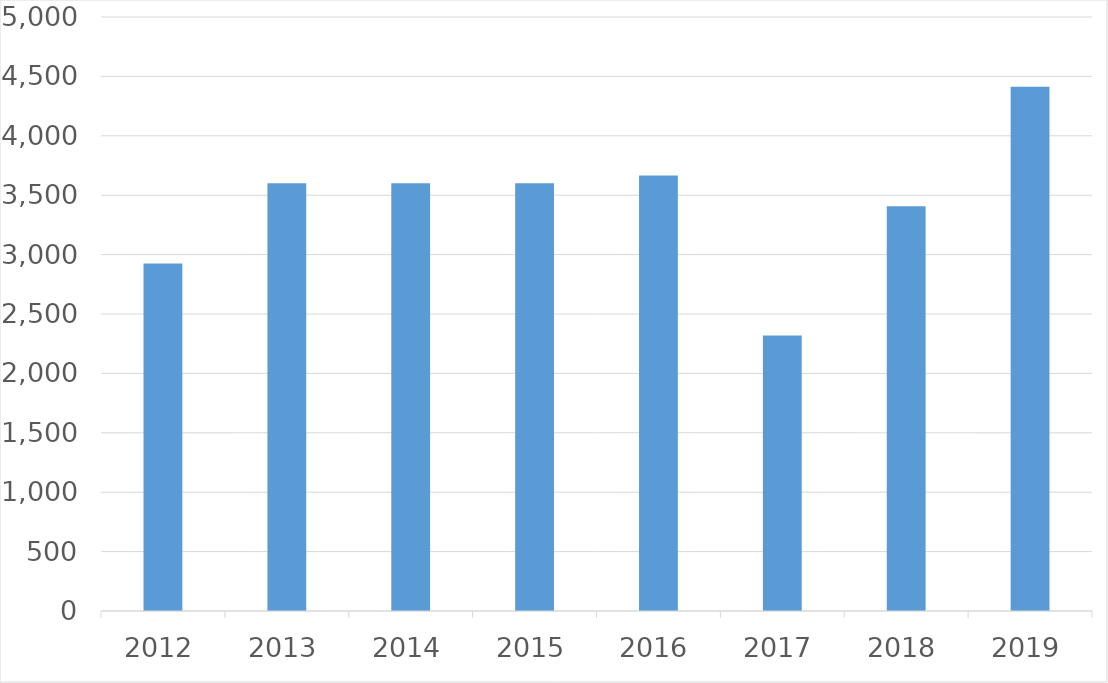
| Category | Series 0 |
|---|---|
| 2012 | 2925 |
| 2013 | 3600 |
| 2014 | 3600 |
| 2015 | 3600 |
| 2016 | 3666 |
| 2017 | 2320 |
| 2018 | 3406 |
| 2019 | 4413 |